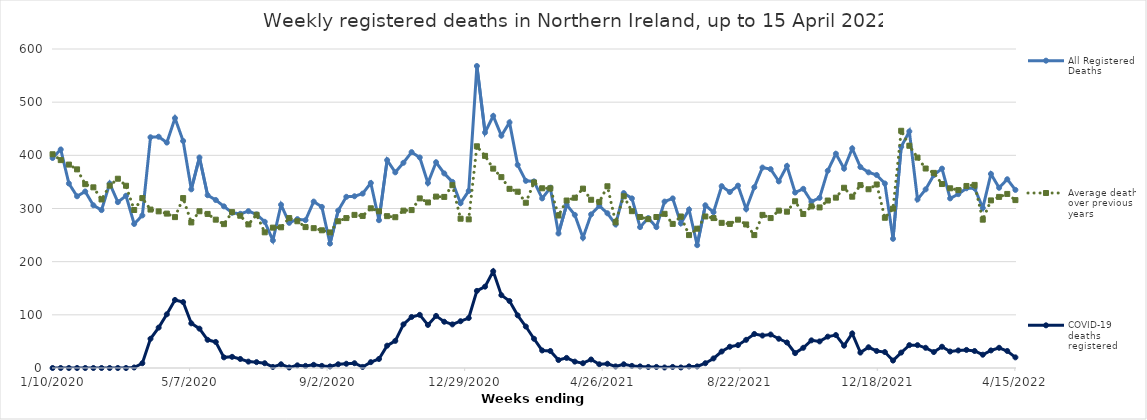
| Category | All Registered Deaths | Average deaths over previous 5 years | COVID-19 deaths registered |
|---|---|---|---|
| 1/10/20 | 395 | 402 | 0 |
| 1/17/20 | 411 | 391 | 0 |
| 1/24/20 | 347 | 382.6 | 0 |
| 1/31/20 | 323 | 373.6 | 0 |
| 2/7/20 | 332 | 345.8 | 0 |
| 2/14/20 | 306 | 339.8 | 0 |
| 2/21/20 | 297 | 317 | 0 |
| 2/28/20 | 347 | 343 | 0 |
| 3/6/20 | 312 | 356 | 0 |
| 3/13/20 | 324 | 342.8 | 0 |
| 3/20/20 | 271 | 297.2 | 1 |
| 3/27/20 | 287 | 319.6 | 9 |
| 4/3/20 | 434 | 298 | 55 |
| 4/10/20 | 435 | 294.6 | 76 |
| 4/17/20 | 424 | 290.4 | 101 |
| 4/24/20 | 470 | 283.8 | 128 |
| 5/1/20 | 427 | 319.6 | 124 |
| 5/8/20 | 336 | 273.8 | 84 |
| 5/15/20 | 396 | 294.8 | 74 |
| 5/22/20 | 325 | 289.8 | 53 |
| 5/29/20 | 316 | 279 | 49 |
| 6/5/20 | 304 | 270.6 | 20 |
| 6/12/20 | 292 | 293.2 | 21 |
| 6/19/20 | 290 | 286.4 | 17 |
| 6/26/20 | 295 | 270 | 12 |
| 7/3/20 | 289 | 288.2 | 11 |
| 7/10/20 | 275 | 255.2 | 9 |
| 7/17/20 | 240 | 264 | 2 |
| 7/24/20 | 307 | 264.6 | 7 |
| 7/31/20 | 273 | 282 | 1 |
| 8/7/20 | 280 | 276 | 5 |
| 8/14/20 | 278 | 265 | 4 |
| 8/21/20 | 313 | 263 | 6 |
| 8/28/20 | 303 | 259 | 4 |
| 9/4/20 | 234 | 255 | 3 |
| 9/11/20 | 296 | 276 | 7 |
| 9/18/20 | 322 | 282 | 8 |
| 9/25/20 | 323 | 288 | 9 |
| 10/2/20 | 328 | 286 | 2 |
| 10/9/20 | 348 | 300.4 | 11 |
| 10/16/20 | 278 | 294.8 | 17 |
| 10/23/20 | 391 | 285.6 | 42 |
| 10/30/20 | 368 | 283.6 | 51 |
| 11/6/20 | 386 | 296 | 82 |
| 11/13/20 | 406 | 297 | 96 |
| 11/20/20 | 396 | 319 | 100 |
| 11/27/20 | 348 | 311.4 | 81 |
| 12/4/20 | 387 | 322.4 | 98 |
| 12/11/20 | 366 | 321.8 | 87 |
| 12/18/20 | 350 | 343.8 | 82 |
| 12/25/20 | 310 | 280.8 | 88 |
| 1/1/21 | 333 | 279.6 | 94 |
| 1/8/21 | 568 | 417 | 145 |
| 1/15/21 | 443 | 399 | 153 |
| 1/22/21 | 474 | 375 | 182 |
| 1/29/21 | 437 | 359 | 137 |
| 2/5/21 | 462 | 337 | 126 |
| 2/12/21 | 382 | 331.6 | 99 |
| 2/19/21 | 352 | 310.8 | 78 |
| 2/26/21 | 351 | 349 | 55 |
| 3/5/21 | 319 | 338 | 33 |
| 3/12/21 | 339 | 338 | 32 |
| 3/19/21 | 253 | 286.8 | 15 |
| 3/26/21 | 307 | 315 | 19 |
| 4/2/21 | 288 | 320.2 | 12 |
| 4/9/21 | 245 | 337.4 | 9 |
| 4/16/21 | 289 | 316.4 | 16 |
| 4/23/21 | 305 | 312.4 | 7 |
| 4/30/21 | 291 | 341.8 | 8 |
| 5/7/21 | 270 | 274 | 3 |
| 5/14/21 | 329 | 323 | 7 |
| 5/21/21 | 319 | 295 | 4 |
| 5/28/21 | 265 | 284 | 3 |
| 6/4/21 | 282 | 280 | 2 |
| 6/11/21 | 265 | 284 | 2 |
| 6/18/21 | 313 | 290 | 1 |
| 6/25/21 | 319 | 271 | 2 |
| 7/2/21 | 272 | 285 | 1 |
| 7/9/21 | 298 | 250 | 3 |
| 7/16/21 | 231 | 262 | 3 |
| 7/23/21 | 306 | 285 | 9 |
| 7/30/21 | 293 | 282 | 18 |
| 8/6/21 | 342 | 273 | 31 |
| 8/13/21 | 331 | 271 | 40 |
| 8/20/21 | 343 | 279 | 43 |
| 8/27/21 | 299 | 270 | 53 |
| 9/3/21 | 340 | 250 | 64 |
| 9/10/21 | 377 | 288 | 61 |
| 9/17/21 | 374 | 282 | 63 |
| 9/24/21 | 351 | 296 | 55 |
| 10/1/21 | 380 | 294 | 48 |
| 10/8/21 | 330 | 313.6 | 28 |
| 10/15/21 | 337 | 289.6 | 38 |
| 10/22/21 | 313 | 304 | 52 |
| 10/29/21 | 320 | 302 | 50 |
| 11/5/21 | 371 | 315 | 59 |
| 11/12/21 | 403 | 320.4 | 62 |
| 11/19/21 | 375 | 339 | 42 |
| 11/26/21 | 413 | 322.2 | 65 |
| 12/3/21 | 378 | 344 | 29 |
| 12/10/21 | 368 | 336.2 | 39 |
| 12/17/21 | 363 | 345.2 | 32 |
| 12/24/21 | 347 | 282.6 | 30 |
| 12/31/21 | 243 | 299.8 | 14 |
| 1/7/22 | 416 | 446.2 | 29 |
| 1/14/22 | 445 | 418 | 43 |
| 1/21/22 | 317 | 395.8 | 43 |
| 1/28/22 | 336 | 375.2 | 38 |
| 2/4/22 | 363 | 367 | 30 |
| 2/11/22 | 375 | 346 | 40 |
| 2/18/22 | 319 | 338 | 31 |
| 2/25/22 | 327 | 334.6 | 33 |
| 3/4/22 | 338 | 342.4 | 34 |
| 3/11/22 | 338 | 344.4 | 32 |
| 3/18/22 | 301 | 279 | 25 |
| 3/25/22 | 365 | 315.2 | 33 |
| 4/1/22 | 339 | 321.8 | 38 |
| 4/8/22 | 355 | 327.4 | 32 |
| 4/15/22 | 335 | 315.8 | 20 |